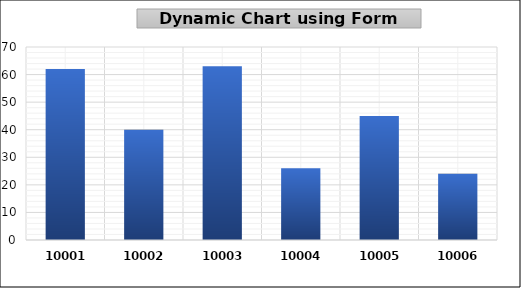
| Category | Sales |
|---|---|
| 10001.0 | 62 |
| 10002.0 | 40 |
| 10003.0 | 63 |
| 10004.0 | 26 |
| 10005.0 | 45 |